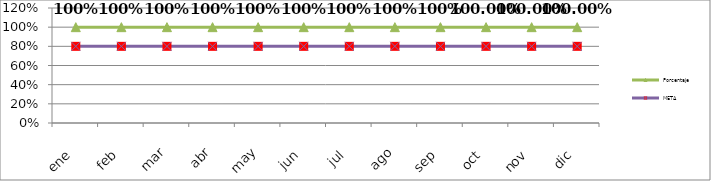
| Category | Porcentaje | META  |
|---|---|---|
| ene | 1 | 0.8 |
| feb | 1 | 0.8 |
| mar | 1 | 0.8 |
| abr | 1 | 0.8 |
| may | 1 | 0.8 |
| jun | 1 | 0.8 |
| jul | 1 | 0.8 |
| ago | 1 | 0.8 |
| sep | 1 | 0.8 |
| oct | 1 | 0.8 |
| nov | 1 | 0.8 |
| dic | 1 | 0.8 |